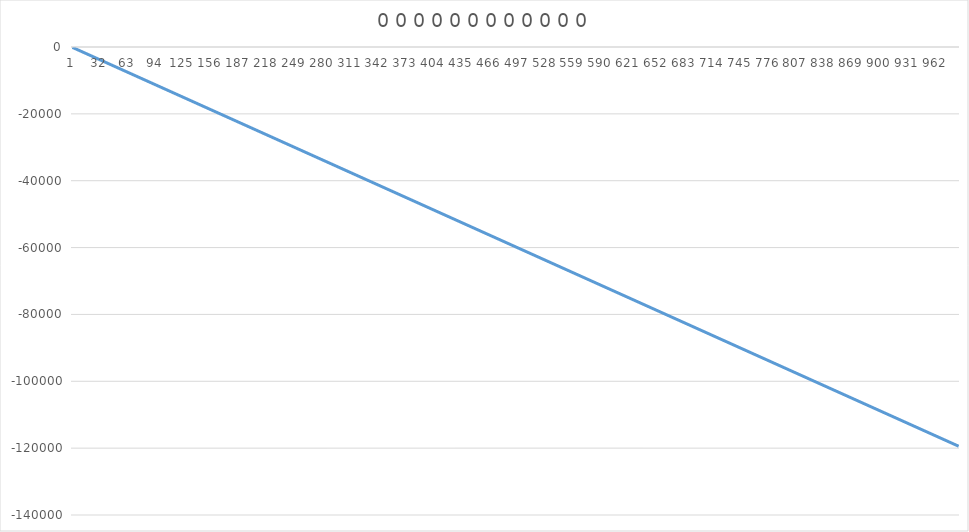
| Category | Series 0 |
|---|---|
| 0 | -121 |
| 1 | -242 |
| 2 | -363 |
| 3 | -484 |
| 4 | -605 |
| 5 | -726 |
| 6 | -847 |
| 7 | -968 |
| 8 | -1089 |
| 9 | -1210 |
| 10 | -1331 |
| 11 | -1452 |
| 12 | -1573 |
| 13 | -1694 |
| 14 | -1815 |
| 15 | -1936 |
| 16 | -2057 |
| 17 | -2178 |
| 18 | -2299 |
| 19 | -2420 |
| 20 | -2541 |
| 21 | -2662 |
| 22 | -2783 |
| 23 | -2904 |
| 24 | -3025 |
| 25 | -3146 |
| 26 | -3267 |
| 27 | -3388 |
| 28 | -3509 |
| 29 | -3630 |
| 30 | -3751 |
| 31 | -3872 |
| 32 | -3993 |
| 33 | -4114 |
| 34 | -4235 |
| 35 | -4356 |
| 36 | -4477 |
| 37 | -4598 |
| 38 | -4719 |
| 39 | -4840 |
| 40 | -4961 |
| 41 | -5082 |
| 42 | -5203 |
| 43 | -5324 |
| 44 | -5445 |
| 45 | -5566 |
| 46 | -5687 |
| 47 | -5808 |
| 48 | -5929 |
| 49 | -6050 |
| 50 | -6171 |
| 51 | -6292 |
| 52 | -6413 |
| 53 | -6534 |
| 54 | -6655 |
| 55 | -6776 |
| 56 | -6897 |
| 57 | -7018 |
| 58 | -7139 |
| 59 | -7260 |
| 60 | -7381 |
| 61 | -7502 |
| 62 | -7623 |
| 63 | -7744 |
| 64 | -7865 |
| 65 | -7986 |
| 66 | -8107 |
| 67 | -8228 |
| 68 | -8349 |
| 69 | -8470 |
| 70 | -8591 |
| 71 | -8712 |
| 72 | -8833 |
| 73 | -8954 |
| 74 | -9075 |
| 75 | -9196 |
| 76 | -9317 |
| 77 | -9438 |
| 78 | -9559 |
| 79 | -9680 |
| 80 | -9801 |
| 81 | -9922 |
| 82 | -10043 |
| 83 | -10164 |
| 84 | -10285 |
| 85 | -10406 |
| 86 | -10527 |
| 87 | -10648 |
| 88 | -10769 |
| 89 | -10890 |
| 90 | -11011 |
| 91 | -11132 |
| 92 | -11253 |
| 93 | -11374 |
| 94 | -11495 |
| 95 | -11616 |
| 96 | -11737 |
| 97 | -11858 |
| 98 | -11979 |
| 99 | -12100 |
| 100 | -12221 |
| 101 | -12342 |
| 102 | -12463 |
| 103 | -12584 |
| 104 | -12705 |
| 105 | -12826 |
| 106 | -12947 |
| 107 | -13068 |
| 108 | -13189 |
| 109 | -13310 |
| 110 | -13431 |
| 111 | -13552 |
| 112 | -13673 |
| 113 | -13794 |
| 114 | -13915 |
| 115 | -14036 |
| 116 | -14157 |
| 117 | -14278 |
| 118 | -14399 |
| 119 | -14520 |
| 120 | -14641 |
| 121 | -14762 |
| 122 | -14883 |
| 123 | -15004 |
| 124 | -15125 |
| 125 | -15246 |
| 126 | -15367 |
| 127 | -15488 |
| 128 | -15609 |
| 129 | -15730 |
| 130 | -15851 |
| 131 | -15972 |
| 132 | -16093 |
| 133 | -16214 |
| 134 | -16335 |
| 135 | -16456 |
| 136 | -16577 |
| 137 | -16698 |
| 138 | -16819 |
| 139 | -16940 |
| 140 | -17061 |
| 141 | -17182 |
| 142 | -17303 |
| 143 | -17424 |
| 144 | -17545 |
| 145 | -17666 |
| 146 | -17787 |
| 147 | -17908 |
| 148 | -18029 |
| 149 | -18150 |
| 150 | -18271 |
| 151 | -18392 |
| 152 | -18513 |
| 153 | -18634 |
| 154 | -18755 |
| 155 | -18876 |
| 156 | -18997 |
| 157 | -19118 |
| 158 | -19239 |
| 159 | -19360 |
| 160 | -19481 |
| 161 | -19602 |
| 162 | -19723 |
| 163 | -19844 |
| 164 | -19965 |
| 165 | -20086 |
| 166 | -20207 |
| 167 | -20328 |
| 168 | -20449 |
| 169 | -20570 |
| 170 | -20691 |
| 171 | -20812 |
| 172 | -20933 |
| 173 | -21054 |
| 174 | -21175 |
| 175 | -21296 |
| 176 | -21417 |
| 177 | -21538 |
| 178 | -21659 |
| 179 | -21780 |
| 180 | -21901 |
| 181 | -22022 |
| 182 | -22143 |
| 183 | -22264 |
| 184 | -22385 |
| 185 | -22506 |
| 186 | -22627 |
| 187 | -22748 |
| 188 | -22869 |
| 189 | -22990 |
| 190 | -23111 |
| 191 | -23232 |
| 192 | -23353 |
| 193 | -23474 |
| 194 | -23595 |
| 195 | -23716 |
| 196 | -23837 |
| 197 | -23958 |
| 198 | -24079 |
| 199 | -24200 |
| 200 | -24321 |
| 201 | -24442 |
| 202 | -24563 |
| 203 | -24684 |
| 204 | -24805 |
| 205 | -24926 |
| 206 | -25047 |
| 207 | -25168 |
| 208 | -25289 |
| 209 | -25410 |
| 210 | -25531 |
| 211 | -25652 |
| 212 | -25773 |
| 213 | -25894 |
| 214 | -26015 |
| 215 | -26136 |
| 216 | -26257 |
| 217 | -26378 |
| 218 | -26499 |
| 219 | -26620 |
| 220 | -26741 |
| 221 | -26862 |
| 222 | -26983 |
| 223 | -27104 |
| 224 | -27225 |
| 225 | -27346 |
| 226 | -27467 |
| 227 | -27588 |
| 228 | -27709 |
| 229 | -27830 |
| 230 | -27951 |
| 231 | -28072 |
| 232 | -28193 |
| 233 | -28314 |
| 234 | -28435 |
| 235 | -28556 |
| 236 | -28677 |
| 237 | -28798 |
| 238 | -28919 |
| 239 | -29040 |
| 240 | -29161 |
| 241 | -29282 |
| 242 | -29403 |
| 243 | -29524 |
| 244 | -29645 |
| 245 | -29766 |
| 246 | -29887 |
| 247 | -30008 |
| 248 | -30129 |
| 249 | -30250 |
| 250 | -30371 |
| 251 | -30492 |
| 252 | -30613 |
| 253 | -30734 |
| 254 | -30855 |
| 255 | -30976 |
| 256 | -31097 |
| 257 | -31218 |
| 258 | -31339 |
| 259 | -31460 |
| 260 | -31581 |
| 261 | -31702 |
| 262 | -31823 |
| 263 | -31944 |
| 264 | -32065 |
| 265 | -32186 |
| 266 | -32307 |
| 267 | -32428 |
| 268 | -32549 |
| 269 | -32670 |
| 270 | -32791 |
| 271 | -32912 |
| 272 | -33033 |
| 273 | -33154 |
| 274 | -33275 |
| 275 | -33396 |
| 276 | -33517 |
| 277 | -33638 |
| 278 | -33759 |
| 279 | -33880 |
| 280 | -34001 |
| 281 | -34122 |
| 282 | -34243 |
| 283 | -34364 |
| 284 | -34485 |
| 285 | -34606 |
| 286 | -34727 |
| 287 | -34848 |
| 288 | -34969 |
| 289 | -35090 |
| 290 | -35211 |
| 291 | -35332 |
| 292 | -35453 |
| 293 | -35574 |
| 294 | -35695 |
| 295 | -35816 |
| 296 | -35937 |
| 297 | -36058 |
| 298 | -36179 |
| 299 | -36300 |
| 300 | -36421 |
| 301 | -36542 |
| 302 | -36663 |
| 303 | -36784 |
| 304 | -36905 |
| 305 | -37026 |
| 306 | -37147 |
| 307 | -37268 |
| 308 | -37389 |
| 309 | -37510 |
| 310 | -37631 |
| 311 | -37752 |
| 312 | -37873 |
| 313 | -37994 |
| 314 | -38115 |
| 315 | -38236 |
| 316 | -38357 |
| 317 | -38478 |
| 318 | -38599 |
| 319 | -38720 |
| 320 | -38841 |
| 321 | -38962 |
| 322 | -39083 |
| 323 | -39204 |
| 324 | -39325 |
| 325 | -39446 |
| 326 | -39567 |
| 327 | -39688 |
| 328 | -39809 |
| 329 | -39930 |
| 330 | -40051 |
| 331 | -40172 |
| 332 | -40293 |
| 333 | -40414 |
| 334 | -40535 |
| 335 | -40656 |
| 336 | -40777 |
| 337 | -40898 |
| 338 | -41019 |
| 339 | -41140 |
| 340 | -41261 |
| 341 | -41382 |
| 342 | -41503 |
| 343 | -41624 |
| 344 | -41745 |
| 345 | -41866 |
| 346 | -41987 |
| 347 | -42108 |
| 348 | -42229 |
| 349 | -42350 |
| 350 | -42471 |
| 351 | -42592 |
| 352 | -42713 |
| 353 | -42834 |
| 354 | -42955 |
| 355 | -43076 |
| 356 | -43197 |
| 357 | -43318 |
| 358 | -43439 |
| 359 | -43560 |
| 360 | -43681 |
| 361 | -43802 |
| 362 | -43923 |
| 363 | -44044 |
| 364 | -44165 |
| 365 | -44286 |
| 366 | -44407 |
| 367 | -44528 |
| 368 | -44649 |
| 369 | -44770 |
| 370 | -44891 |
| 371 | -45012 |
| 372 | -45133 |
| 373 | -45254 |
| 374 | -45375 |
| 375 | -45496 |
| 376 | -45617 |
| 377 | -45738 |
| 378 | -45859 |
| 379 | -45980 |
| 380 | -46101 |
| 381 | -46222 |
| 382 | -46343 |
| 383 | -46464 |
| 384 | -46585 |
| 385 | -46706 |
| 386 | -46827 |
| 387 | -46948 |
| 388 | -47069 |
| 389 | -47190 |
| 390 | -47311 |
| 391 | -47432 |
| 392 | -47553 |
| 393 | -47674 |
| 394 | -47795 |
| 395 | -47916 |
| 396 | -48037 |
| 397 | -48158 |
| 398 | -48279 |
| 399 | -48400 |
| 400 | -48521 |
| 401 | -48642 |
| 402 | -48763 |
| 403 | -48884 |
| 404 | -49005 |
| 405 | -49126 |
| 406 | -49247 |
| 407 | -49368 |
| 408 | -49489 |
| 409 | -49610 |
| 410 | -49731 |
| 411 | -49852 |
| 412 | -49973 |
| 413 | -50094 |
| 414 | -50215 |
| 415 | -50336 |
| 416 | -50457 |
| 417 | -50578 |
| 418 | -50699 |
| 419 | -50820 |
| 420 | -50941 |
| 421 | -51062 |
| 422 | -51183 |
| 423 | -51304 |
| 424 | -51425 |
| 425 | -51546 |
| 426 | -51667 |
| 427 | -51788 |
| 428 | -51909 |
| 429 | -52030 |
| 430 | -52151 |
| 431 | -52272 |
| 432 | -52393 |
| 433 | -52514 |
| 434 | -52635 |
| 435 | -52756 |
| 436 | -52877 |
| 437 | -52998 |
| 438 | -53119 |
| 439 | -53240 |
| 440 | -53361 |
| 441 | -53482 |
| 442 | -53603 |
| 443 | -53724 |
| 444 | -53845 |
| 445 | -53966 |
| 446 | -54087 |
| 447 | -54208 |
| 448 | -54329 |
| 449 | -54450 |
| 450 | -54571 |
| 451 | -54692 |
| 452 | -54813 |
| 453 | -54934 |
| 454 | -55055 |
| 455 | -55176 |
| 456 | -55297 |
| 457 | -55418 |
| 458 | -55539 |
| 459 | -55660 |
| 460 | -55781 |
| 461 | -55902 |
| 462 | -56023 |
| 463 | -56144 |
| 464 | -56265 |
| 465 | -56386 |
| 466 | -56507 |
| 467 | -56628 |
| 468 | -56749 |
| 469 | -56870 |
| 470 | -56991 |
| 471 | -57112 |
| 472 | -57233 |
| 473 | -57354 |
| 474 | -57475 |
| 475 | -57596 |
| 476 | -57717 |
| 477 | -57838 |
| 478 | -57959 |
| 479 | -58080 |
| 480 | -58201 |
| 481 | -58322 |
| 482 | -58443 |
| 483 | -58564 |
| 484 | -58685 |
| 485 | -58806 |
| 486 | -58927 |
| 487 | -59048 |
| 488 | -59169 |
| 489 | -59290 |
| 490 | -59411 |
| 491 | -59532 |
| 492 | -59653 |
| 493 | -59774 |
| 494 | -59895 |
| 495 | -60016 |
| 496 | -60137 |
| 497 | -60258 |
| 498 | -60379 |
| 499 | -60500 |
| 500 | -60621 |
| 501 | -60742 |
| 502 | -60863 |
| 503 | -60984 |
| 504 | -61105 |
| 505 | -61226 |
| 506 | -61347 |
| 507 | -61468 |
| 508 | -61589 |
| 509 | -61710 |
| 510 | -61831 |
| 511 | -61952 |
| 512 | -62073 |
| 513 | -62194 |
| 514 | -62315 |
| 515 | -62436 |
| 516 | -62557 |
| 517 | -62678 |
| 518 | -62799 |
| 519 | -62920 |
| 520 | -63041 |
| 521 | -63162 |
| 522 | -63283 |
| 523 | -63404 |
| 524 | -63525 |
| 525 | -63646 |
| 526 | -63767 |
| 527 | -63888 |
| 528 | -64009 |
| 529 | -64130 |
| 530 | -64251 |
| 531 | -64372 |
| 532 | -64493 |
| 533 | -64614 |
| 534 | -64735 |
| 535 | -64856 |
| 536 | -64977 |
| 537 | -65098 |
| 538 | -65219 |
| 539 | -65340 |
| 540 | -65461 |
| 541 | -65582 |
| 542 | -65703 |
| 543 | -65824 |
| 544 | -65945 |
| 545 | -66066 |
| 546 | -66187 |
| 547 | -66308 |
| 548 | -66429 |
| 549 | -66550 |
| 550 | -66671 |
| 551 | -66792 |
| 552 | -66913 |
| 553 | -67034 |
| 554 | -67155 |
| 555 | -67276 |
| 556 | -67397 |
| 557 | -67518 |
| 558 | -67639 |
| 559 | -67760 |
| 560 | -67881 |
| 561 | -68002 |
| 562 | -68123 |
| 563 | -68244 |
| 564 | -68365 |
| 565 | -68486 |
| 566 | -68607 |
| 567 | -68728 |
| 568 | -68849 |
| 569 | -68970 |
| 570 | -69091 |
| 571 | -69212 |
| 572 | -69333 |
| 573 | -69454 |
| 574 | -69575 |
| 575 | -69696 |
| 576 | -69817 |
| 577 | -69938 |
| 578 | -70059 |
| 579 | -70180 |
| 580 | -70301 |
| 581 | -70422 |
| 582 | -70543 |
| 583 | -70664 |
| 584 | -70785 |
| 585 | -70906 |
| 586 | -71027 |
| 587 | -71148 |
| 588 | -71269 |
| 589 | -71390 |
| 590 | -71511 |
| 591 | -71632 |
| 592 | -71753 |
| 593 | -71874 |
| 594 | -71995 |
| 595 | -72116 |
| 596 | -72237 |
| 597 | -72358 |
| 598 | -72479 |
| 599 | -72600 |
| 600 | -72721 |
| 601 | -72842 |
| 602 | -72963 |
| 603 | -73084 |
| 604 | -73205 |
| 605 | -73326 |
| 606 | -73447 |
| 607 | -73568 |
| 608 | -73689 |
| 609 | -73810 |
| 610 | -73931 |
| 611 | -74052 |
| 612 | -74173 |
| 613 | -74294 |
| 614 | -74415 |
| 615 | -74536 |
| 616 | -74657 |
| 617 | -74778 |
| 618 | -74899 |
| 619 | -75020 |
| 620 | -75141 |
| 621 | -75262 |
| 622 | -75383 |
| 623 | -75504 |
| 624 | -75625 |
| 625 | -75746 |
| 626 | -75867 |
| 627 | -75988 |
| 628 | -76109 |
| 629 | -76230 |
| 630 | -76351 |
| 631 | -76472 |
| 632 | -76593 |
| 633 | -76714 |
| 634 | -76835 |
| 635 | -76956 |
| 636 | -77077 |
| 637 | -77198 |
| 638 | -77319 |
| 639 | -77440 |
| 640 | -77561 |
| 641 | -77682 |
| 642 | -77803 |
| 643 | -77924 |
| 644 | -78045 |
| 645 | -78166 |
| 646 | -78287 |
| 647 | -78408 |
| 648 | -78529 |
| 649 | -78650 |
| 650 | -78771 |
| 651 | -78892 |
| 652 | -79013 |
| 653 | -79134 |
| 654 | -79255 |
| 655 | -79376 |
| 656 | -79497 |
| 657 | -79618 |
| 658 | -79739 |
| 659 | -79860 |
| 660 | -79981 |
| 661 | -80102 |
| 662 | -80223 |
| 663 | -80344 |
| 664 | -80465 |
| 665 | -80586 |
| 666 | -80707 |
| 667 | -80828 |
| 668 | -80949 |
| 669 | -81070 |
| 670 | -81191 |
| 671 | -81312 |
| 672 | -81433 |
| 673 | -81554 |
| 674 | -81675 |
| 675 | -81796 |
| 676 | -81917 |
| 677 | -82038 |
| 678 | -82159 |
| 679 | -82280 |
| 680 | -82401 |
| 681 | -82522 |
| 682 | -82643 |
| 683 | -82764 |
| 684 | -82885 |
| 685 | -83006 |
| 686 | -83127 |
| 687 | -83248 |
| 688 | -83369 |
| 689 | -83490 |
| 690 | -83611 |
| 691 | -83732 |
| 692 | -83853 |
| 693 | -83974 |
| 694 | -84095 |
| 695 | -84216 |
| 696 | -84337 |
| 697 | -84458 |
| 698 | -84579 |
| 699 | -84700 |
| 700 | -84821 |
| 701 | -84942 |
| 702 | -85063 |
| 703 | -85184 |
| 704 | -85305 |
| 705 | -85426 |
| 706 | -85547 |
| 707 | -85668 |
| 708 | -85789 |
| 709 | -85910 |
| 710 | -86031 |
| 711 | -86152 |
| 712 | -86273 |
| 713 | -86394 |
| 714 | -86515 |
| 715 | -86636 |
| 716 | -86757 |
| 717 | -86878 |
| 718 | -86999 |
| 719 | -87120 |
| 720 | -87241 |
| 721 | -87362 |
| 722 | -87483 |
| 723 | -87604 |
| 724 | -87725 |
| 725 | -87846 |
| 726 | -87967 |
| 727 | -88088 |
| 728 | -88209 |
| 729 | -88330 |
| 730 | -88451 |
| 731 | -88572 |
| 732 | -88693 |
| 733 | -88814 |
| 734 | -88935 |
| 735 | -89056 |
| 736 | -89177 |
| 737 | -89298 |
| 738 | -89419 |
| 739 | -89540 |
| 740 | -89661 |
| 741 | -89782 |
| 742 | -89903 |
| 743 | -90024 |
| 744 | -90145 |
| 745 | -90266 |
| 746 | -90387 |
| 747 | -90508 |
| 748 | -90629 |
| 749 | -90750 |
| 750 | -90871 |
| 751 | -90992 |
| 752 | -91113 |
| 753 | -91234 |
| 754 | -91355 |
| 755 | -91476 |
| 756 | -91597 |
| 757 | -91718 |
| 758 | -91839 |
| 759 | -91960 |
| 760 | -92081 |
| 761 | -92202 |
| 762 | -92323 |
| 763 | -92444 |
| 764 | -92565 |
| 765 | -92686 |
| 766 | -92807 |
| 767 | -92928 |
| 768 | -93049 |
| 769 | -93170 |
| 770 | -93291 |
| 771 | -93412 |
| 772 | -93533 |
| 773 | -93654 |
| 774 | -93775 |
| 775 | -93896 |
| 776 | -94017 |
| 777 | -94138 |
| 778 | -94259 |
| 779 | -94380 |
| 780 | -94501 |
| 781 | -94622 |
| 782 | -94743 |
| 783 | -94864 |
| 784 | -94985 |
| 785 | -95106 |
| 786 | -95227 |
| 787 | -95348 |
| 788 | -95469 |
| 789 | -95590 |
| 790 | -95711 |
| 791 | -95832 |
| 792 | -95953 |
| 793 | -96074 |
| 794 | -96195 |
| 795 | -96316 |
| 796 | -96437 |
| 797 | -96558 |
| 798 | -96679 |
| 799 | -96800 |
| 800 | -96921 |
| 801 | -97042 |
| 802 | -97163 |
| 803 | -97284 |
| 804 | -97405 |
| 805 | -97526 |
| 806 | -97647 |
| 807 | -97768 |
| 808 | -97889 |
| 809 | -98010 |
| 810 | -98131 |
| 811 | -98252 |
| 812 | -98373 |
| 813 | -98494 |
| 814 | -98615 |
| 815 | -98736 |
| 816 | -98857 |
| 817 | -98978 |
| 818 | -99099 |
| 819 | -99220 |
| 820 | -99341 |
| 821 | -99462 |
| 822 | -99583 |
| 823 | -99704 |
| 824 | -99825 |
| 825 | -99946 |
| 826 | -100067 |
| 827 | -100188 |
| 828 | -100309 |
| 829 | -100430 |
| 830 | -100551 |
| 831 | -100672 |
| 832 | -100793 |
| 833 | -100914 |
| 834 | -101035 |
| 835 | -101156 |
| 836 | -101277 |
| 837 | -101398 |
| 838 | -101519 |
| 839 | -101640 |
| 840 | -101761 |
| 841 | -101882 |
| 842 | -102003 |
| 843 | -102124 |
| 844 | -102245 |
| 845 | -102366 |
| 846 | -102487 |
| 847 | -102608 |
| 848 | -102729 |
| 849 | -102850 |
| 850 | -102971 |
| 851 | -103092 |
| 852 | -103213 |
| 853 | -103334 |
| 854 | -103455 |
| 855 | -103576 |
| 856 | -103697 |
| 857 | -103818 |
| 858 | -103939 |
| 859 | -104060 |
| 860 | -104181 |
| 861 | -104302 |
| 862 | -104423 |
| 863 | -104544 |
| 864 | -104665 |
| 865 | -104786 |
| 866 | -104907 |
| 867 | -105028 |
| 868 | -105149 |
| 869 | -105270 |
| 870 | -105391 |
| 871 | -105512 |
| 872 | -105633 |
| 873 | -105754 |
| 874 | -105875 |
| 875 | -105996 |
| 876 | -106117 |
| 877 | -106238 |
| 878 | -106359 |
| 879 | -106480 |
| 880 | -106601 |
| 881 | -106722 |
| 882 | -106843 |
| 883 | -106964 |
| 884 | -107085 |
| 885 | -107206 |
| 886 | -107327 |
| 887 | -107448 |
| 888 | -107569 |
| 889 | -107690 |
| 890 | -107811 |
| 891 | -107932 |
| 892 | -108053 |
| 893 | -108174 |
| 894 | -108295 |
| 895 | -108416 |
| 896 | -108537 |
| 897 | -108658 |
| 898 | -108779 |
| 899 | -108900 |
| 900 | -109021 |
| 901 | -109142 |
| 902 | -109263 |
| 903 | -109384 |
| 904 | -109505 |
| 905 | -109626 |
| 906 | -109747 |
| 907 | -109868 |
| 908 | -109989 |
| 909 | -110110 |
| 910 | -110231 |
| 911 | -110352 |
| 912 | -110473 |
| 913 | -110594 |
| 914 | -110715 |
| 915 | -110836 |
| 916 | -110957 |
| 917 | -111078 |
| 918 | -111199 |
| 919 | -111320 |
| 920 | -111441 |
| 921 | -111562 |
| 922 | -111683 |
| 923 | -111804 |
| 924 | -111925 |
| 925 | -112046 |
| 926 | -112167 |
| 927 | -112288 |
| 928 | -112409 |
| 929 | -112530 |
| 930 | -112651 |
| 931 | -112772 |
| 932 | -112893 |
| 933 | -113014 |
| 934 | -113135 |
| 935 | -113256 |
| 936 | -113377 |
| 937 | -113498 |
| 938 | -113619 |
| 939 | -113740 |
| 940 | -113861 |
| 941 | -113982 |
| 942 | -114103 |
| 943 | -114224 |
| 944 | -114345 |
| 945 | -114466 |
| 946 | -114587 |
| 947 | -114708 |
| 948 | -114829 |
| 949 | -114950 |
| 950 | -115071 |
| 951 | -115192 |
| 952 | -115313 |
| 953 | -115434 |
| 954 | -115555 |
| 955 | -115676 |
| 956 | -115797 |
| 957 | -115918 |
| 958 | -116039 |
| 959 | -116160 |
| 960 | -116281 |
| 961 | -116402 |
| 962 | -116523 |
| 963 | -116644 |
| 964 | -116765 |
| 965 | -116886 |
| 966 | -117007 |
| 967 | -117128 |
| 968 | -117249 |
| 969 | -117370 |
| 970 | -117491 |
| 971 | -117612 |
| 972 | -117733 |
| 973 | -117854 |
| 974 | -117975 |
| 975 | -118096 |
| 976 | -118217 |
| 977 | -118338 |
| 978 | -118459 |
| 979 | -118580 |
| 980 | -118701 |
| 981 | -118822 |
| 982 | -118943 |
| 983 | -119064 |
| 984 | -119185 |
| 985 | -119306 |
| 986 | -119427 |
| 987 | -119548 |